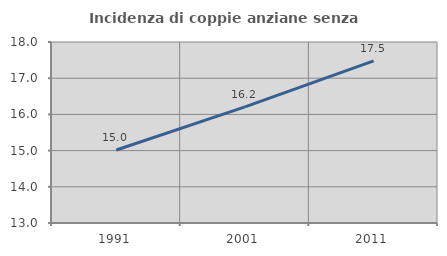
| Category | Incidenza di coppie anziane senza figli  |
|---|---|
| 1991.0 | 15.015 |
| 2001.0 | 16.208 |
| 2011.0 | 17.479 |